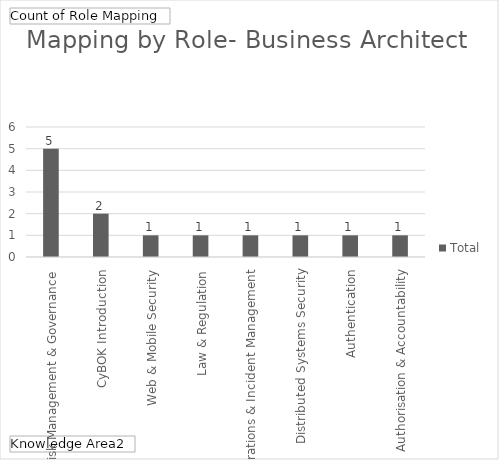
| Category | Total |
|---|---|
| Risk Management & Governance | 5 |
| CyBOK Introduction | 2 |
| Web & Mobile Security | 1 |
| Law & Regulation | 1 |
| Security Operations & Incident Management | 1 |
| Distributed Systems Security | 1 |
| Authentication, Authorisation & Accountability | 1 |
| Human Factors | 1 |